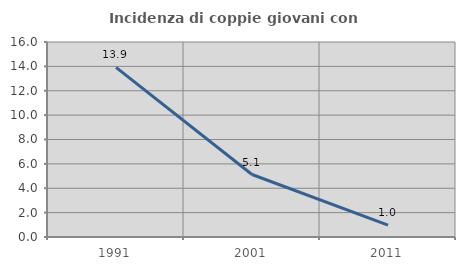
| Category | Incidenza di coppie giovani con figli |
|---|---|
| 1991.0 | 13.913 |
| 2001.0 | 5.128 |
| 2011.0 | 0.971 |